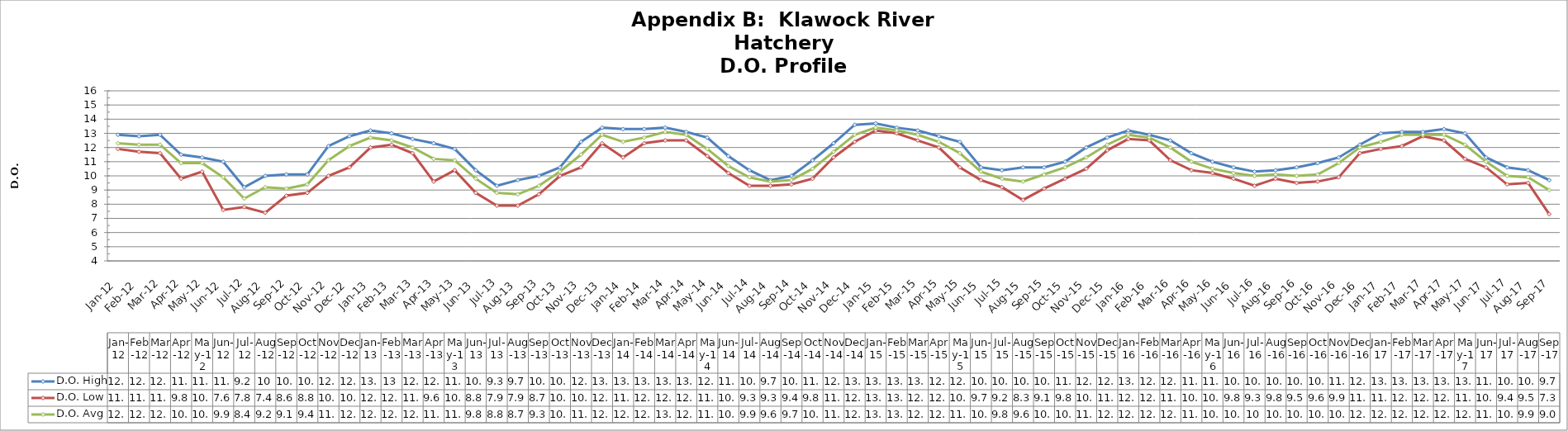
| Category | D.O. High | D.O. Low | D.O. Avg |
|---|---|---|---|
| 2012-01-01 | 12.9 | 11.9 | 12.3 |
| 2012-02-01 | 12.8 | 11.7 | 12.2 |
| 2012-03-01 | 12.9 | 11.6 | 12.2 |
| 2012-04-01 | 11.5 | 9.8 | 10.9 |
| 2012-05-01 | 11.3 | 10.3 | 10.9 |
| 2012-06-01 | 11 | 7.6 | 9.9 |
| 2012-07-01 | 9.2 | 7.8 | 8.4 |
| 2012-08-01 | 10 | 7.4 | 9.2 |
| 2012-09-01 | 10.1 | 8.6 | 9.1 |
| 2012-10-01 | 10.1 | 8.8 | 9.4 |
| 2012-11-01 | 12.1 | 10 | 11.1 |
| 2012-12-01 | 12.8 | 10.6 | 12.1 |
| 2013-01-01 | 13.2 | 12 | 12.7 |
| 2013-02-01 | 13 | 12.2 | 12.5 |
| 2013-03-01 | 12.6 | 11.6 | 12 |
| 2013-04-01 | 12.3 | 9.6 | 11.2 |
| 2013-05-01 | 11.9 | 10.4 | 11.1 |
| 2013-06-01 | 10.4 | 8.8 | 9.8 |
| 2013-07-01 | 9.3 | 7.9 | 8.8 |
| 2013-08-01 | 9.7 | 7.9 | 8.7 |
| 2013-09-01 | 10 | 8.7 | 9.3 |
| 2013-10-01 | 10.6 | 10 | 10.3 |
| 2013-11-01 | 12.4 | 10.6 | 11.5 |
| 2013-12-01 | 13.4 | 12.3 | 12.9 |
| 2014-01-01 | 13.3 | 11.3 | 12.4 |
| 2014-02-01 | 13.3 | 12.3 | 12.7 |
| 2014-03-01 | 13.4 | 12.5 | 13.1 |
| 2014-04-01 | 13.1 | 12.5 | 12.9 |
| 2014-05-01 | 12.7 | 11.4 | 11.9 |
| 2014-06-01 | 11.4 | 10.2 | 10.7 |
| 2014-07-01 | 10.4 | 9.3 | 9.9 |
| 2014-08-01 | 9.7 | 9.3 | 9.6 |
| 2014-09-01 | 10 | 9.4 | 9.7 |
| 2014-10-01 | 11.1 | 9.8 | 10.5 |
| 2014-11-01 | 12.3 | 11.3 | 11.7 |
| 2014-12-01 | 13.6 | 12.4 | 12.9 |
| 2015-01-01 | 13.7 | 13.2 | 13.4 |
| 2015-02-01 | 13.4 | 13 | 13.2 |
| 2015-03-01 | 13.2 | 12.5 | 12.9 |
| 2015-04-01 | 12.8 | 12 | 12.4 |
| 2015-05-01 | 12.4 | 10.6 | 11.6 |
| 2015-06-01 | 10.6 | 9.7 | 10.3 |
| 2015-07-01 | 10.4 | 9.2 | 9.8 |
| 2015-08-01 | 10.6 | 8.3 | 9.6 |
| 2015-09-01 | 10.6 | 9.1 | 10.1 |
| 2015-10-01 | 11 | 9.8 | 10.6 |
| 2015-11-01 | 12 | 10.5 | 11.3 |
| 2015-12-01 | 12.7 | 11.8 | 12.2 |
| 2016-01-01 | 13.2 | 12.6 | 12.9 |
| 2016-02-01 | 12.9 | 12.5 | 12.7 |
| 2016-03-01 | 12.5 | 11.1 | 12 |
| 2016-04-01 | 11.6 | 10.4 | 11 |
| 2016-05-01 | 11 | 10.2 | 10.5 |
| 2016-06-01 | 10.6 | 9.8 | 10.2 |
| 2016-07-01 | 10.3 | 9.3 | 10 |
| 2016-08-01 | 10.4 | 9.8 | 10.1 |
| 2016-09-01 | 10.6 | 9.5 | 10 |
| 2016-10-01 | 10.9 | 9.6 | 10.1 |
| 2016-11-01 | 11.3 | 9.9 | 10.9 |
| 2016-12-01 | 12.2 | 11.6 | 12 |
| 2017-01-01 | 13 | 11.9 | 12.4 |
| 2017-02-01 | 13.1 | 12.1 | 12.9 |
| 2017-03-01 | 13.1 | 12.8 | 12.9 |
| 2017-04-01 | 13.3 | 12.5 | 12.9 |
| 2017-05-01 | 13 | 11.2 | 12.2 |
| 2017-06-01 | 11.3 | 10.6 | 11 |
| 2017-07-01 | 10.6 | 9.4 | 10 |
| 2017-08-01 | 10.4 | 9.5 | 9.9 |
| 2017-09-01 | 9.7 | 7.3 | 9 |